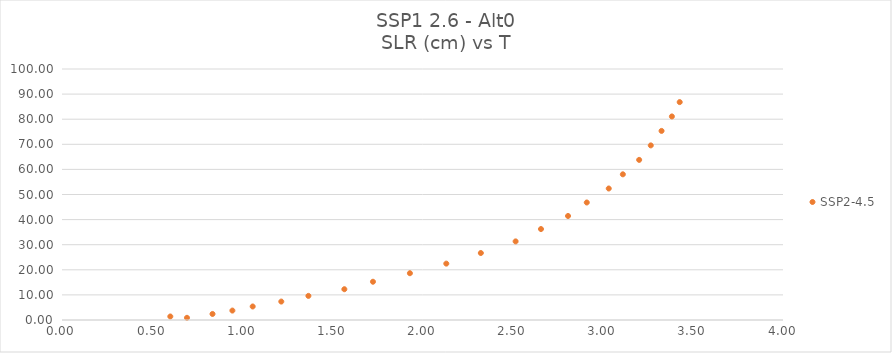
| Category | SSP2-4.5 |
|---|---|
| 0.693400617 | 0.87 |
| 0.600872844 | 1.399 |
| 0.835003234 | 2.407 |
| 0.945258389 | 3.755 |
| 1.057970477 | 5.386 |
| 1.216609042 | 7.344 |
| 1.366998793 | 9.606 |
| 1.566434093 | 12.264 |
| 1.725179017 | 15.242 |
| 1.930157664 | 18.64 |
| 2.132040838 | 22.46 |
| 2.323628479 | 26.685 |
| 2.516636738 | 31.321 |
| 2.657298105 | 36.235 |
| 2.807379279 | 41.443 |
| 2.911363711 | 46.815 |
| 3.033307846 | 52.391 |
| 3.111562119 | 58.041 |
| 3.201994144 | 63.791 |
| 3.266454687 | 69.562 |
| 3.326267987 | 75.335 |
| 3.383598507 | 81.098 |
| 3.426907342 | 86.809 |